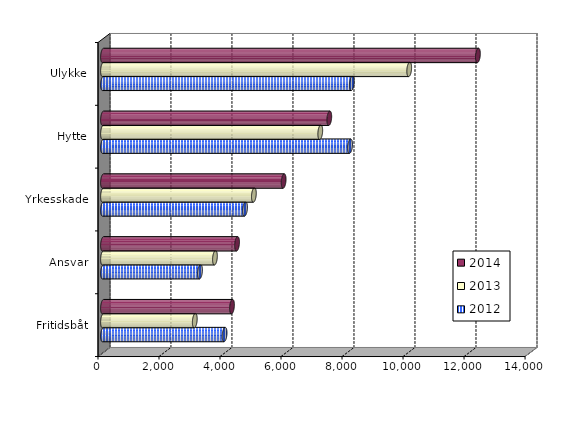
| Category | 2012 | 2013 | 2014 |
|---|---|---|---|
| Fritidsbåt | 3986 | 3009 | 4229 |
| Ansvar | 3180 | 3670 | 4395 |
| Yrkesskade | 4656 | 4946 | 5922 |
| Hytte | 8100 | 7122 | 7418 |
| Ulykke | 8157 | 10038 | 12291 |